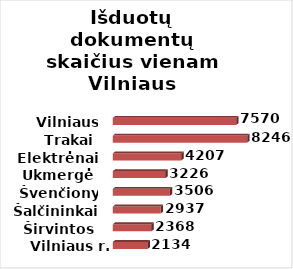
| Category | Series 0 |
|---|---|
| Vilniaus r. | 2134 |
| Širvintos | 2368 |
| Šalčininkai | 2937 |
| Švenčionys | 3506 |
| Ukmergė | 3226 |
| Elektrėnai | 4207 |
| Trakai | 8246 |
| Vilniaus m. | 7570 |